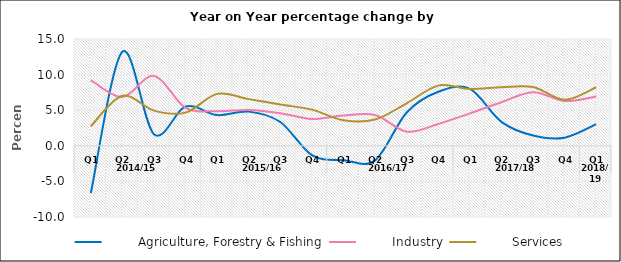
| Category |         Agriculture, Forestry & Fishing |         Industry |         Services |
|---|---|---|---|
| 0 | -6.651 | 9.235 | 2.743 |
| 1 | 13.208 | 6.845 | 7.02 |
| 2 | 1.625 | 9.809 | 4.94 |
| 3 | 5.511 | 5.342 | 4.658 |
| 4 | 4.317 | 4.861 | 7.292 |
| 5 | 4.8 | 5.035 | 6.557 |
| 6 | 3.348 | 4.584 | 5.796 |
| 7 | -1.314 | 3.766 | 5.079 |
| 8 | -2.014 | 4.249 | 3.58 |
| 9 | -2.041 | 4.321 | 3.691 |
| 10 | 4.678 | 1.987 | 5.975 |
| 11 | 7.594 | 3.062 | 8.454 |
| 12 | 7.986 | 4.552 | 7.989 |
| 13 | 3.359 | 6.123 | 8.224 |
| 14 | 1.441 | 7.517 | 8.249 |
| 15 | 1.145 | 6.295 | 6.464 |
| 16 | 3.035 | 6.926 | 8.229 |